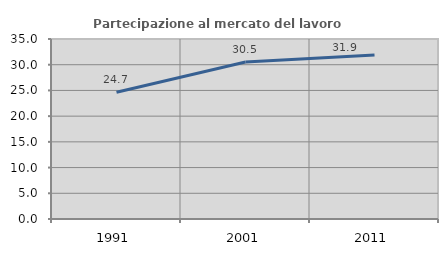
| Category | Partecipazione al mercato del lavoro  femminile |
|---|---|
| 1991.0 | 24.658 |
| 2001.0 | 30.534 |
| 2011.0 | 31.897 |